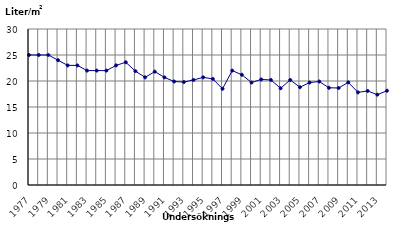
| Category | Oljeförbrukning |
|---|---|
| 1977.0 | 25 |
| 1978.0 | 25 |
| 1979.0 | 25 |
| 1980.0 | 24 |
| 1981.0 | 23 |
| 1982.0 | 23 |
| 1983.0 | 22 |
| 1984.0 | 22 |
| 1985.0 | 22 |
| 1986.0 | 23 |
| 1987.0 | 23.6 |
| 1988.0 | 21.9 |
| 1989.0 | 20.7 |
| 1990.0 | 21.8 |
| 1991.0 | 20.7 |
| 1992.0 | 19.9 |
| 1993.0 | 19.8 |
| 1994.0 | 20.2 |
| 1995.0 | 20.7 |
| 1996.0 | 20.4 |
| 1997.0 | 18.5 |
| 1998.0 | 22 |
| 1999.0 | 21.2 |
| 2000.0 | 19.7 |
| 2001.0 | 20.3 |
| 2002.0 | 20.2 |
| 2003.0 | 18.6 |
| 2004.0 | 20.2 |
| 2005.0 | 18.8 |
| 2006.0 | 19.7 |
| 2007.0 | 19.9 |
| 2008.0 | 18.7 |
| 2009.0 | 18.653 |
| 2010.0 | 19.736 |
| 2011.0 | 17.812 |
| 2012.0 | 18.085 |
| 2013.0 | 17.369 |
| 2014.0 | 18.127 |